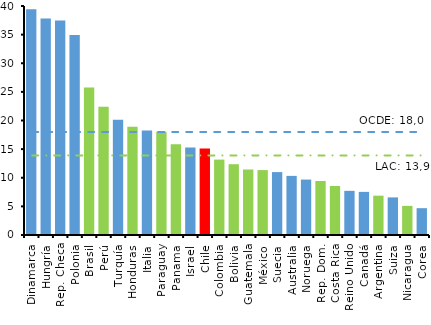
| Category | Series 0 |
|---|---|
| Dinamarca | 39.427 |
| Hungría | 37.828 |
| Rep. Checa | 37.482 |
| Polonia | 34.92 |
| Brasil | 25.75 |
| Perú | 22.423 |
| Turquía | 20.145 |
| Honduras | 18.916 |
| Italia | 18.234 |
| Paraguay | 18.05 |
| Panama | 15.845 |
| Israel | 15.301 |
| Chile | 15.1 |
| Colombia | 13.173 |
| Bolivia | 12.364 |
| Guatemala | 11.443 |
| México | 11.337 |
| Suecia | 10.988 |
| Australia | 10.325 |
| Noruega | 9.684 |
| Rep. Dom. | 9.438 |
| Costa Rica | 8.564 |
| Reino Unido | 7.712 |
| Canadá | 7.53 |
| Argentina | 6.871 |
| Suiza | 6.568 |
| Nicaragua | 5.085 |
| Corea | 4.685 |